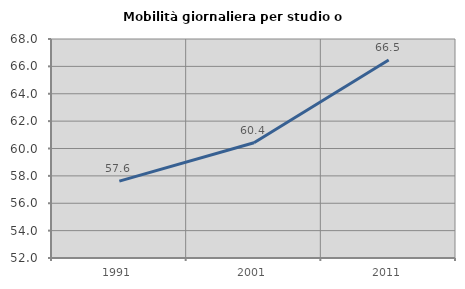
| Category | Mobilità giornaliera per studio o lavoro |
|---|---|
| 1991.0 | 57.62 |
| 2001.0 | 60.424 |
| 2011.0 | 66.463 |